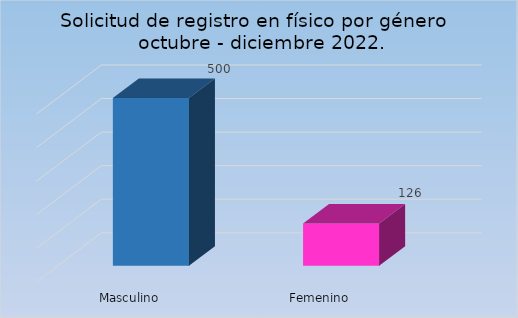
| Category | Cantidad |
|---|---|
| Masculino | 500 |
| Femenino | 126 |